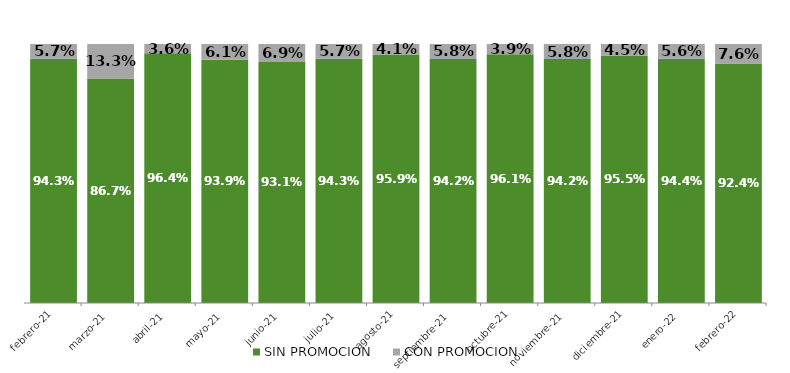
| Category | SIN PROMOCION   | CON PROMOCION   |
|---|---|---|
| 2021-02-01 | 0.943 | 0.057 |
| 2021-03-01 | 0.867 | 0.133 |
| 2021-04-01 | 0.964 | 0.036 |
| 2021-05-01 | 0.939 | 0.061 |
| 2021-06-01 | 0.931 | 0.069 |
| 2021-07-01 | 0.943 | 0.057 |
| 2021-08-01 | 0.959 | 0.041 |
| 2021-09-01 | 0.942 | 0.058 |
| 2021-10-01 | 0.961 | 0.039 |
| 2021-11-01 | 0.942 | 0.058 |
| 2021-12-01 | 0.955 | 0.045 |
| 2022-01-01 | 0.944 | 0.056 |
| 2022-02-01 | 0.924 | 0.076 |